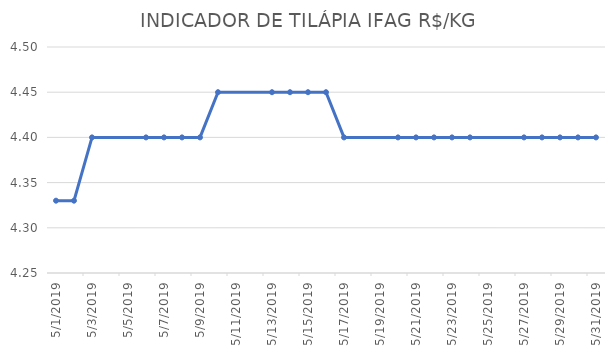
| Category | INDICADOR DE TILÁPIA IFAG |
|---|---|
| 5/1/19 | 4.33 |
| 5/2/19 | 4.33 |
| 5/3/19 | 4.4 |
| 5/6/19 | 4.4 |
| 5/7/19 | 4.4 |
| 5/8/19 | 4.4 |
| 5/9/19 | 4.4 |
| 5/10/19 | 4.45 |
| 5/13/19 | 4.45 |
| 5/14/19 | 4.45 |
| 5/15/19 | 4.45 |
| 5/16/19 | 4.45 |
| 5/17/19 | 4.4 |
| 5/20/19 | 4.4 |
| 5/21/19 | 4.4 |
| 5/22/19 | 4.4 |
| 5/23/19 | 4.4 |
| 5/24/19 | 4.4 |
| 5/27/19 | 4.4 |
| 5/28/19 | 4.4 |
| 5/29/19 | 4.4 |
| 5/30/19 | 4.4 |
| 5/31/19 | 4.4 |